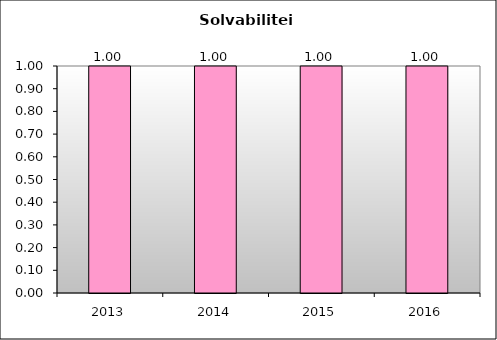
| Category | Series 0 |
|---|---|
| 2013.0 | 1 |
| 2014.0 | 1 |
| 2015.0 | 1 |
| 2016.0 | 1 |